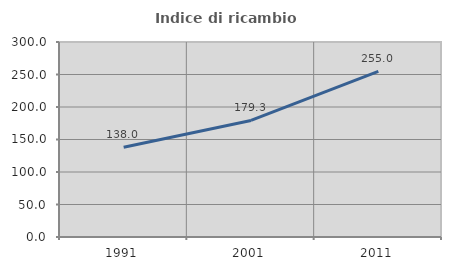
| Category | Indice di ricambio occupazionale  |
|---|---|
| 1991.0 | 138.017 |
| 2001.0 | 179.339 |
| 2011.0 | 254.955 |